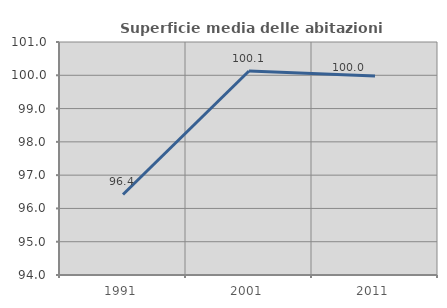
| Category | Superficie media delle abitazioni occupate |
|---|---|
| 1991.0 | 96.419 |
| 2001.0 | 100.13 |
| 2011.0 | 99.979 |